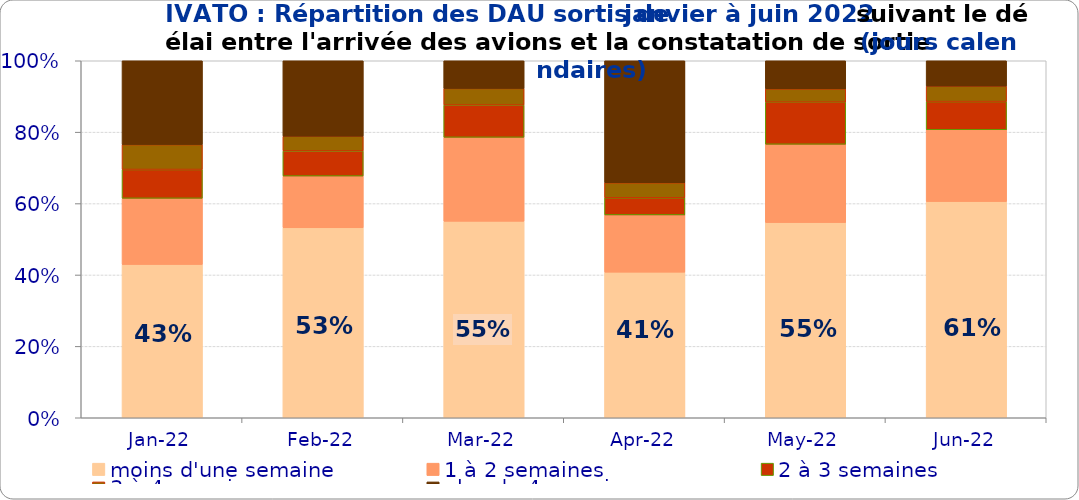
| Category | moins d'une semaine | 1 à 2 semaines | 2 à 3 semaines | 3 à 4 semaines | plus de 4 semaines |
|---|---|---|---|---|---|
| 2022-01-01 | 0.429 | 0.185 | 0.081 | 0.07 | 0.235 |
| 2022-02-01 | 0.532 | 0.145 | 0.07 | 0.041 | 0.211 |
| 2022-03-01 | 0.55 | 0.235 | 0.09 | 0.047 | 0.078 |
| 2022-04-01 | 0.408 | 0.16 | 0.048 | 0.042 | 0.342 |
| 2022-05-01 | 0.547 | 0.219 | 0.118 | 0.037 | 0.079 |
| 2022-06-01 | 0.606 | 0.201 | 0.079 | 0.043 | 0.071 |